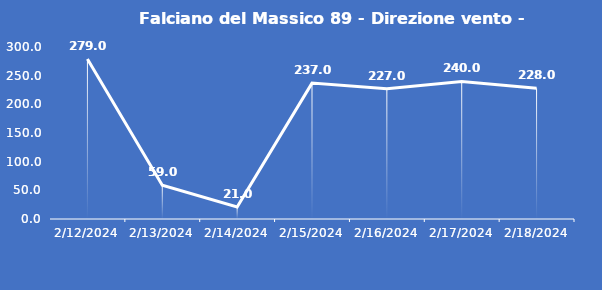
| Category | Falciano del Massico 89 - Direzione vento - Grezzo (°N) |
|---|---|
| 2/12/24 | 279 |
| 2/13/24 | 59 |
| 2/14/24 | 21 |
| 2/15/24 | 237 |
| 2/16/24 | 227 |
| 2/17/24 | 240 |
| 2/18/24 | 228 |